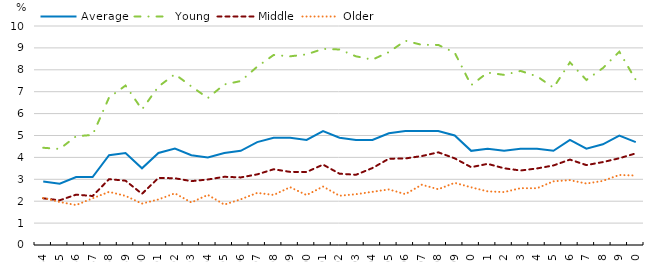
| Category | Average | Young | Middle | Older |
|---|---|---|---|---|
| 1984.0 | 2.9 | 4.44 | 2.131 | 2.151 |
| 1985.0 | 2.8 | 4.386 | 2.042 | 1.962 |
| 1986.0 | 3.1 | 4.968 | 2.299 | 1.824 |
| 1987.0 | 3.1 | 5.025 | 2.237 | 2.13 |
| 1988.0 | 4.1 | 6.736 | 3.007 | 2.427 |
| 1989.0 | 4.2 | 7.281 | 2.936 | 2.243 |
| 1990.0 | 3.5 | 6.19 | 2.336 | 1.891 |
| 1991.0 | 4.2 | 7.235 | 3.065 | 2.08 |
| 1992.0 | 4.4 | 7.798 | 3.047 | 2.361 |
| 1993.0 | 4.1 | 7.242 | 2.916 | 1.942 |
| 1994.0 | 4 | 6.709 | 2.991 | 2.289 |
| 1995.0 | 4.2 | 7.332 | 3.114 | 1.846 |
| 1996.0 | 4.3 | 7.486 | 3.087 | 2.085 |
| 1997.0 | 4.7 | 8.142 | 3.224 | 2.38 |
| 1998.0 | 4.9 | 8.677 | 3.458 | 2.285 |
| 1999.0 | 4.9 | 8.615 | 3.338 | 2.639 |
| 2000.0 | 4.8 | 8.703 | 3.332 | 2.281 |
| 2001.0 | 5.2 | 8.954 | 3.671 | 2.668 |
| 2002.0 | 4.9 | 8.928 | 3.256 | 2.25 |
| 2003.0 | 4.8 | 8.616 | 3.206 | 2.319 |
| 2004.0 | 4.8 | 8.464 | 3.513 | 2.428 |
| 2005.0 | 5.1 | 8.809 | 3.94 | 2.537 |
| 2006.0 | 5.2 | 9.327 | 3.952 | 2.323 |
| 2007.0 | 5.2 | 9.14 | 4.061 | 2.75 |
| 2008.0 | 5.2 | 9.136 | 4.232 | 2.547 |
| 2009.0 | 5 | 8.784 | 3.957 | 2.837 |
| 2010.0 | 4.3 | 7.299 | 3.552 | 2.634 |
| 2011.0 | 4.4 | 7.874 | 3.706 | 2.448 |
| 2012.0 | 4.3 | 7.767 | 3.503 | 2.416 |
| 2013.0 | 4.4 | 7.949 | 3.402 | 2.595 |
| 2014.0 | 4.4 | 7.702 | 3.496 | 2.591 |
| 2015.0 | 4.3 | 7.183 | 3.632 | 2.908 |
| 2016.0 | 4.8 | 8.34 | 3.9 | 2.962 |
| 2017.0 | 4.4 | 7.535 | 3.649 | 2.806 |
| 2018.0 | 4.6 | 8.077 | 3.786 | 2.927 |
| 2019.0 | 5 | 8.827 | 3.961 | 3.197 |
| 2020.0 | 4.7 | 7.537 | 4.184 | 3.173 |